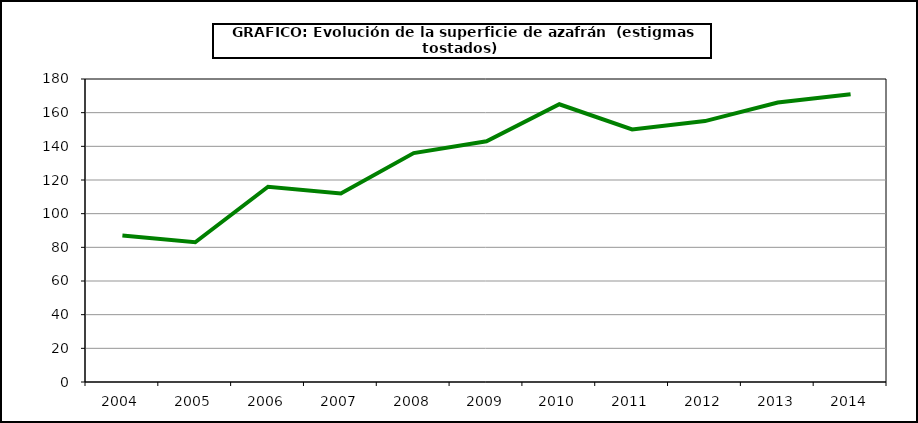
| Category | Superficie |
|---|---|
| 2004.0 | 87 |
| 2005.0 | 83 |
| 2006.0 | 116 |
| 2007.0 | 112 |
| 2008.0 | 136 |
| 2009.0 | 143 |
| 2010.0 | 165 |
| 2011.0 | 150 |
| 2012.0 | 155 |
| 2013.0 | 166 |
| 2014.0 | 171 |